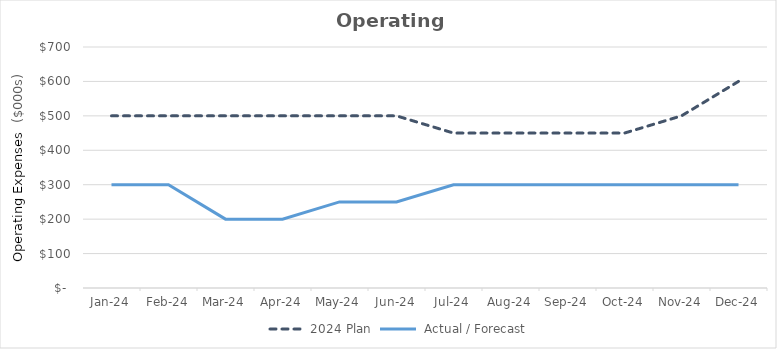
| Category | 2024 Plan |  Actual / Forecast |
|---|---|---|
| 2024-01-31 | 500 | 300 |
| 2024-02-29 | 500 | 300 |
| 2024-03-31 | 500 | 200 |
| 2024-04-30 | 500 | 200 |
| 2024-05-31 | 500 | 250 |
| 2024-06-30 | 500 | 250 |
| 2024-07-31 | 450 | 300 |
| 2024-08-31 | 450 | 300 |
| 2024-09-30 | 450 | 300 |
| 2024-10-31 | 450 | 300 |
| 2024-11-30 | 500 | 300 |
| 2024-12-31 | 600 | 300 |